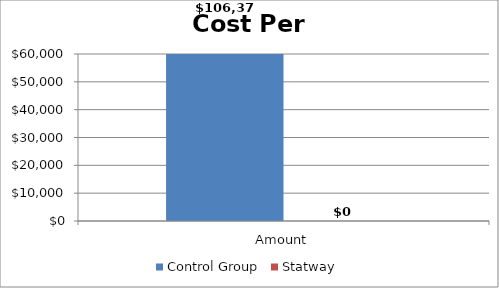
| Category | Control Group | Statway |
|---|---|---|
| Amount | 106375 | 0 |